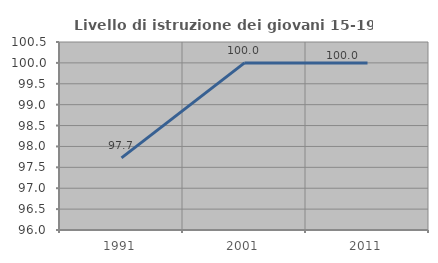
| Category | Livello di istruzione dei giovani 15-19 anni |
|---|---|
| 1991.0 | 97.727 |
| 2001.0 | 100 |
| 2011.0 | 100 |